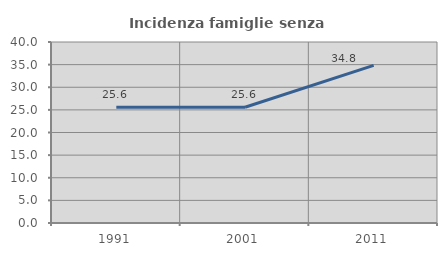
| Category | Incidenza famiglie senza nuclei |
|---|---|
| 1991.0 | 25.598 |
| 2001.0 | 25.591 |
| 2011.0 | 34.845 |